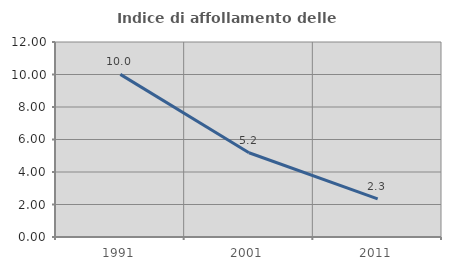
| Category | Indice di affollamento delle abitazioni  |
|---|---|
| 1991.0 | 10.006 |
| 2001.0 | 5.187 |
| 2011.0 | 2.348 |